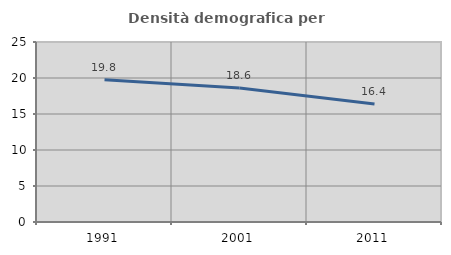
| Category | Densità demografica |
|---|---|
| 1991.0 | 19.769 |
| 2001.0 | 18.624 |
| 2011.0 | 16.39 |